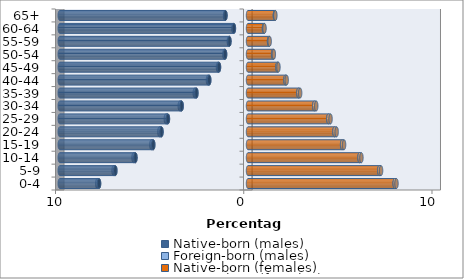
| Category | Native-born (males) | Foreign-born (males) | Native-born (females) | Foreign-born (females) |
|---|---|---|---|---|
| 0-4 | -7.912 | -0.097 | 7.792 | 0.096 |
| 5-9 | -7.047 | -0.096 | 6.972 | 0.097 |
| 10-14 | -5.979 | -0.102 | 5.921 | 0.105 |
| 15-19 | -5.033 | -0.103 | 4.998 | 0.107 |
| 20-24 | -4.595 | -0.114 | 4.591 | 0.119 |
| 25-29 | -4.253 | -0.112 | 4.266 | 0.119 |
| 30-34 | -3.525 | -0.101 | 3.518 | 0.107 |
| 35-39 | -2.74 | -0.089 | 2.676 | 0.094 |
| 40-44 | -2.059 | -0.069 | 1.985 | 0.071 |
| 45-49 | -1.541 | -0.054 | 1.564 | 0.054 |
| 50-54 | -1.217 | -0.04 | 1.333 | 0.04 |
| 55-59 | -0.986 | -0.033 | 1.117 | 0.033 |
| 60-64 | -0.748 | -0.027 | 0.849 | 0.029 |
| 65+ | -1.197 | -0.022 | 1.429 | 0.024 |